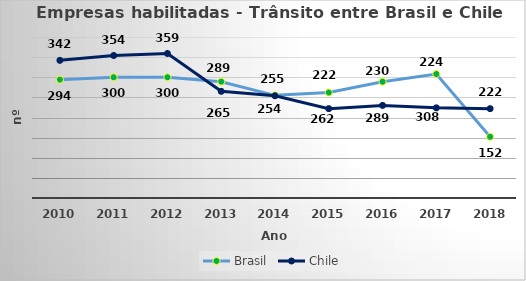
| Category | Brasil | Chile |
|---|---|---|
| 2010.0 | 294 | 342 |
| 2011.0 | 300 | 354 |
| 2012.0 | 300 | 359 |
| 2013.0 | 289 | 265 |
| 2014.0 | 255 | 254 |
| 2015.0 | 262 | 222 |
| 2016.0 | 289 | 230 |
| 2017.0 | 308 | 224 |
| 2018.0 | 152 | 222 |